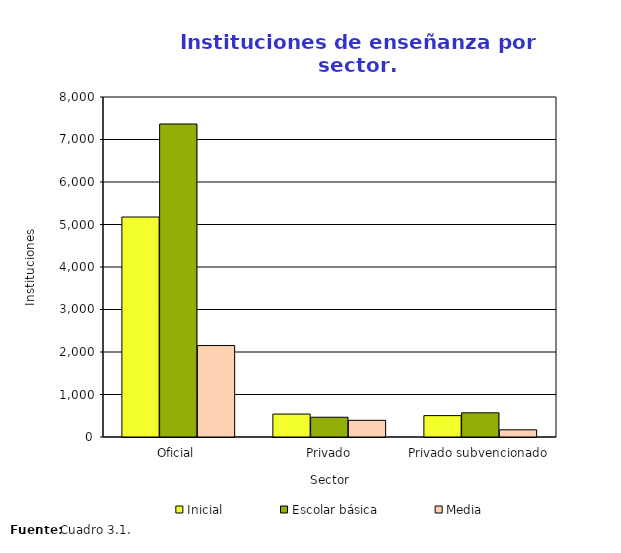
| Category | Inicial | Escolar básica | Media |
|---|---|---|---|
| Oficial | 5176 | 7365 | 2152 |
| Privado | 540 | 465 | 392 |
| Privado subvencionado | 503 | 569 | 169 |